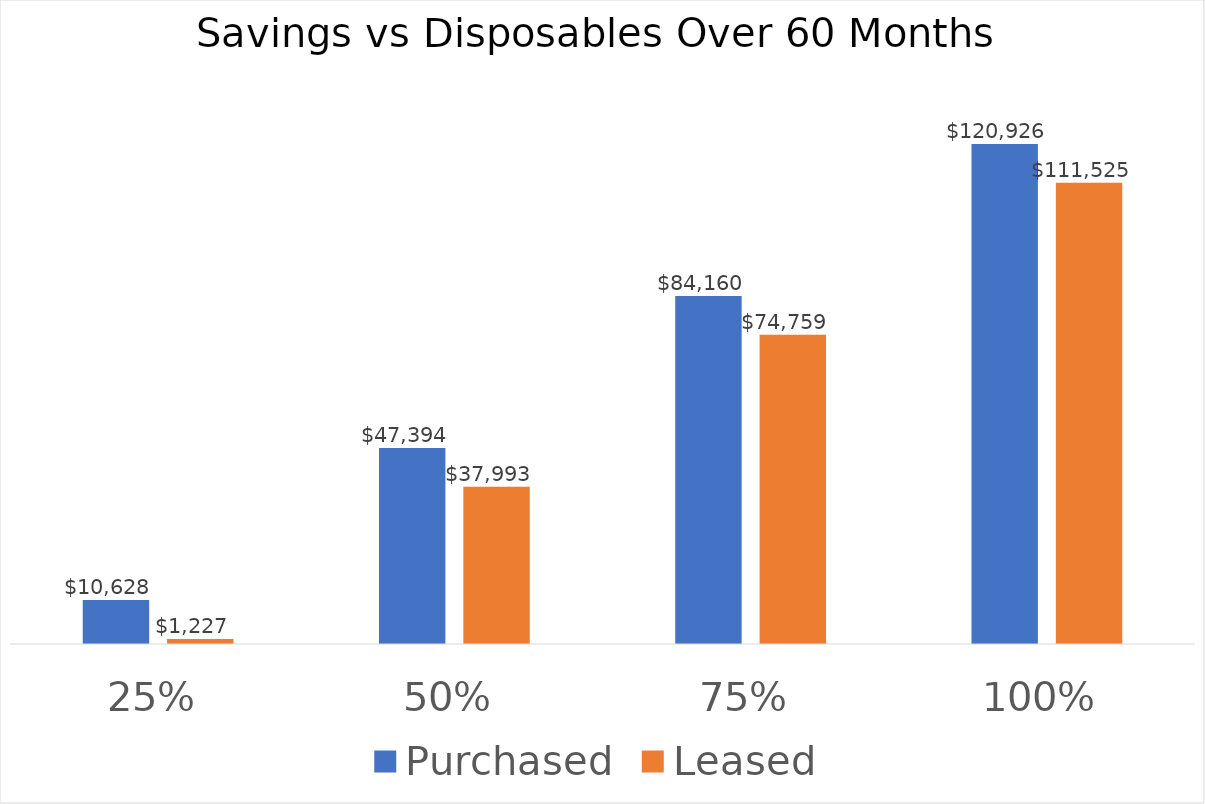
| Category | Purchased | Leased |
|---|---|---|
| 0.25 | 10628.31 | 1227.31 |
| 0.5 | 47394.06 | 37993.06 |
| 0.75 | 84159.81 | 74758.81 |
| 1.0 | 120925.56 | 111524.56 |